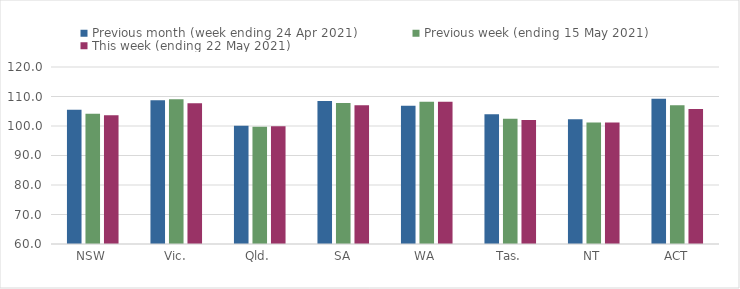
| Category | Previous month (week ending 24 Apr 2021) | Previous week (ending 15 May 2021) | This week (ending 22 May 2021) |
|---|---|---|---|
| NSW | 105.55 | 104.17 | 103.66 |
| Vic. | 108.71 | 109.05 | 107.72 |
| Qld. | 100.08 | 99.75 | 99.89 |
| SA | 108.45 | 107.79 | 107.02 |
| WA | 106.84 | 108.24 | 108.25 |
| Tas. | 103.97 | 102.43 | 102 |
| NT | 102.28 | 101.21 | 101.21 |
| ACT | 109.25 | 107.03 | 105.77 |